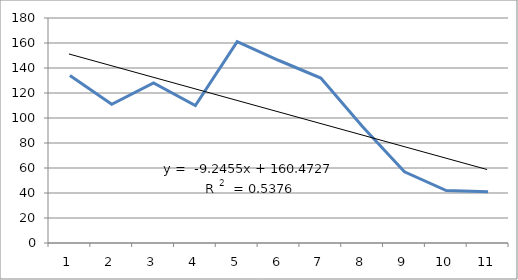
| Category | Series 0 |
|---|---|
| 0 | 134 |
| 1 | 111 |
| 2 | 128 |
| 3 | 110 |
| 4 | 161 |
| 5 | 146 |
| 6 | 132 |
| 7 | 93 |
| 8 | 57 |
| 9 | 42 |
| 10 | 41 |